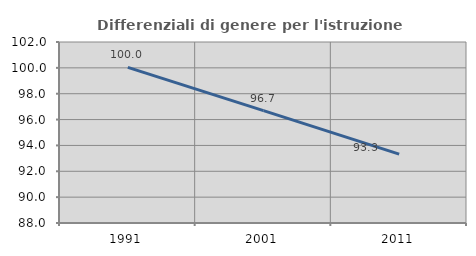
| Category | Differenziali di genere per l'istruzione superiore |
|---|---|
| 1991.0 | 100.039 |
| 2001.0 | 96.691 |
| 2011.0 | 93.322 |